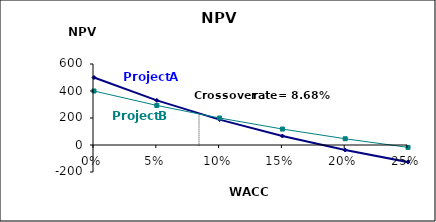
| Category | $187.83  | $199.85  |
|---|---|---|
| 0.0 | 500 | 400 |
| 0.05 | 330.526 | 292.949 |
| 0.1 | 187.829 | 199.85 |
| 0.15000000000000002 | 66.656 | 118.271 |
| 0.2 | -37.037 | 46.296 |
| 0.25 | -126.4 | -17.6 |